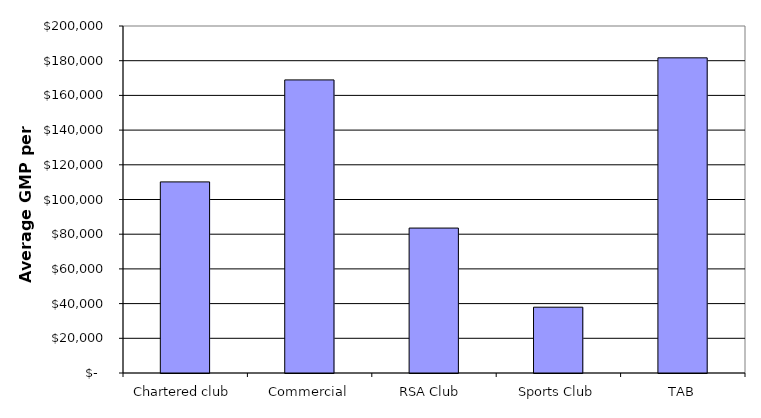
| Category | Series 0 |
|---|---|
| Chartered club | 110144.066 |
| Commercial | 168923.855 |
| RSA Club  | 83535.842 |
| Sports Club | 37924.628 |
| TAB | 181648.987 |